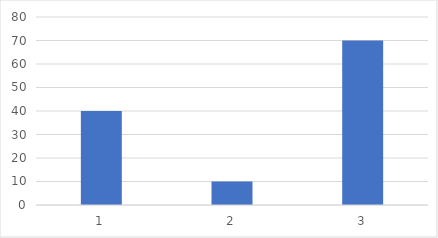
| Category | Series 0 |
|---|---|
| 0 | 40 |
| 1 | 10 |
| 2 | 70 |